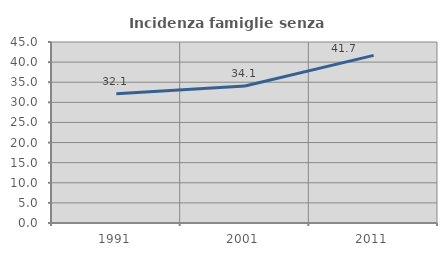
| Category | Incidenza famiglie senza nuclei |
|---|---|
| 1991.0 | 32.117 |
| 2001.0 | 34.071 |
| 2011.0 | 41.667 |